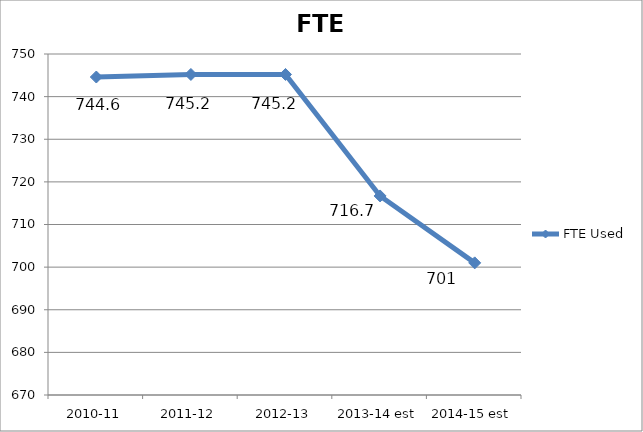
| Category | FTE Used |
|---|---|
| 2010-11 | 744.6 |
| 2011-12 | 745.2 |
| 2012-13 | 745.2 |
| 2013-14 est | 716.7 |
| 2014-15 est | 701 |